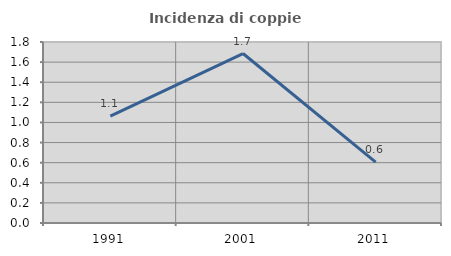
| Category | Incidenza di coppie miste |
|---|---|
| 1991.0 | 1.064 |
| 2001.0 | 1.685 |
| 2011.0 | 0.606 |